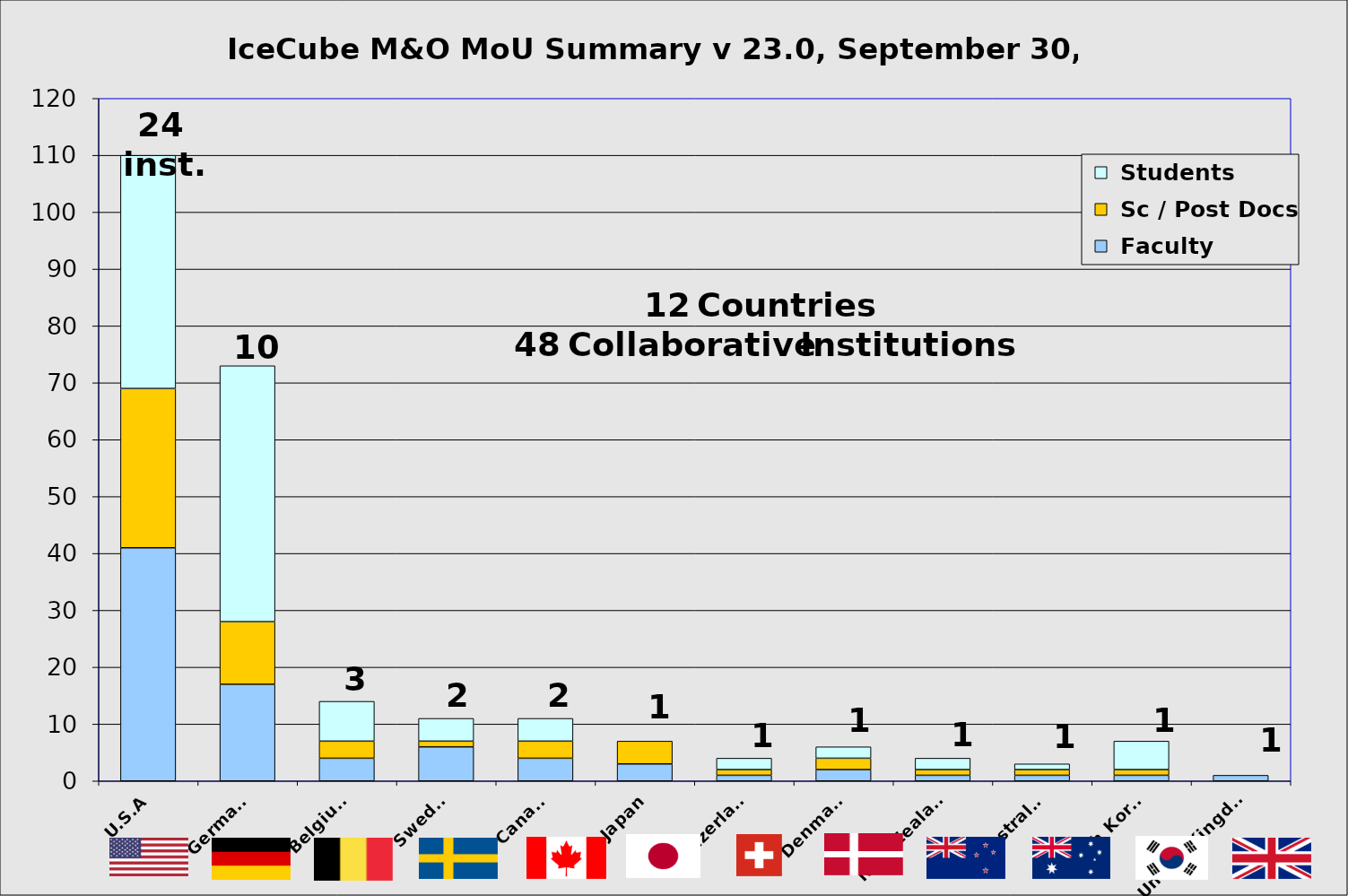
| Category |  Faculty |  Sc / Post Docs |  Students |
|---|---|---|---|
| U.S.A | 41 | 28 | 41 |
| Germany | 17 | 11 | 45 |
| Belgium | 4 | 3 | 7 |
| Sweden | 6 | 1 | 4 |
| Canada | 4 | 3 | 4 |
| Japan | 3 | 4 | 0 |
| Switzerland | 1 | 1 | 2 |
| Denmark | 2 | 2 | 2 |
| New Zealand | 1 | 1 | 2 |
| Australia | 1 | 1 | 1 |
| South Korea | 1 | 1 | 5 |
| United Kingdom | 1 | 0 | 0 |